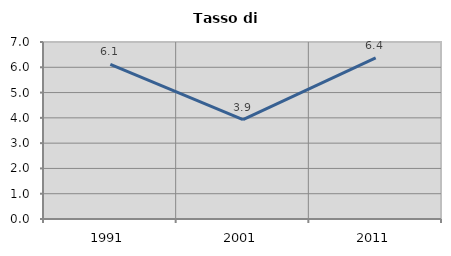
| Category | Tasso di disoccupazione   |
|---|---|
| 1991.0 | 6.119 |
| 2001.0 | 3.926 |
| 2011.0 | 6.374 |